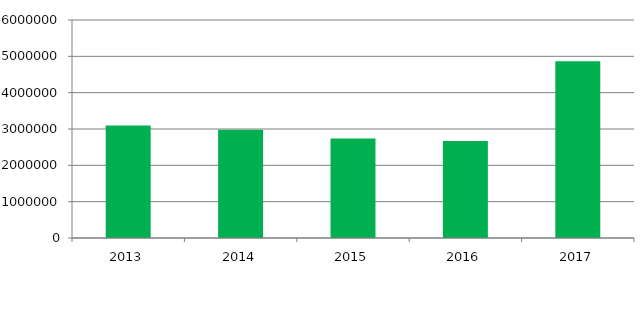
| Category |  Other Expenditures  |
|---|---|
| 2013.0 | 3093467 |
| 2014.0 | 2982018 |
| 2015.0 | 2735154 |
| 2016.0 | 2668988 |
| 2017.0 | 4864378 |